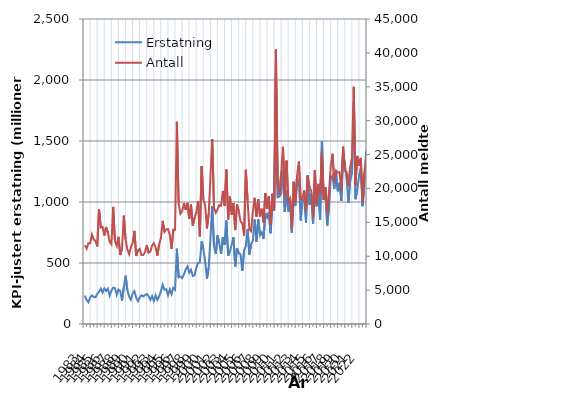
| Category | Erstatning |
|---|---|
| 1983.0 | 232.937 |
| nan | 195.121 |
| nan | 178.438 |
| nan | 218.579 |
| 1984.0 | 234.389 |
| nan | 221.715 |
| nan | 219.826 |
| nan | 245.877 |
| 1985.0 | 265.702 |
| nan | 290.42 |
| nan | 257.346 |
| nan | 291.865 |
| 1986.0 | 270.604 |
| nan | 289.558 |
| nan | 233.055 |
| nan | 272.728 |
| 1987.0 | 297.95 |
| nan | 294.021 |
| nan | 240.61 |
| nan | 283.085 |
| 1988.0 | 269.44 |
| nan | 192.069 |
| nan | 299.153 |
| nan | 396.293 |
| 1989.0 | 279.972 |
| nan | 226.285 |
| nan | 199.112 |
| nan | 251.201 |
| 1990.0 | 268.971 |
| nan | 216.388 |
| nan | 187.666 |
| nan | 218.436 |
| 1991.0 | 235.713 |
| nan | 226.637 |
| nan | 237.191 |
| nan | 245.226 |
| 1992.0 | 229.086 |
| nan | 197.393 |
| nan | 228.083 |
| nan | 188.213 |
| 1993.0 | 236.156 |
| nan | 196.535 |
| nan | 227.061 |
| nan | 268.62 |
| 1994.0 | 321.731 |
| nan | 281.266 |
| nan | 285.763 |
| nan | 235.54 |
| 1995.0 | 283.776 |
| nan | 244.132 |
| nan | 296.645 |
| nan | 281.65 |
| 1996.0 | 617.657 |
| nan | 382.464 |
| nan | 389.296 |
| nan | 375.446 |
| 1997.0 | 406.453 |
| nan | 446.013 |
| nan | 472.333 |
| nan | 421.43 |
| 1998.0 | 444.599 |
| nan | 393.872 |
| nan | 400.307 |
| nan | 460.108 |
| 1999.0 | 501.845 |
| nan | 504.283 |
| nan | 678.577 |
| nan | 614.541 |
| 2000.0 | 512.261 |
| nan | 372.014 |
| nan | 461.192 |
| nan | 703.176 |
| 2001.0 | 965.028 |
| nan | 638.852 |
| nan | 573.774 |
| nan | 725.942 |
| 2002.0 | 661.156 |
| nan | 575.27 |
| nan | 710.935 |
| nan | 647.82 |
| 2003.0 | 847.26 |
| nan | 560.178 |
| nan | 595.958 |
| nan | 649.208 |
| 2004.0 | 712.217 |
| nan | 470.87 |
| nan | 622.509 |
| nan | 581.854 |
| 2005.0 | 569.493 |
| nan | 434.602 |
| nan | 603.345 |
| nan | 639.394 |
| 2006.0 | 777.195 |
| nan | 569.965 |
| nan | 655.815 |
| nan | 684.196 |
| 2007.0 | 856.408 |
| nan | 673.317 |
| nan | 860.276 |
| nan | 727.347 |
| 2008.0 | 752.172 |
| nan | 696.322 |
| nan | 909.437 |
| nan | 873.42 |
| 2009.0 | 916.557 |
| nan | 744.098 |
| nan | 982.934 |
| nan | 929.078 |
| 2010.0 | 2038.021 |
| nan | 1039.492 |
| nan | 1044.493 |
| nan | 1068.56 |
| 2011.0 | 1262.842 |
| nan | 918.31 |
| nan | 1094.943 |
| nan | 922.779 |
| 2012.0 | 1022.313 |
| nan | 747.404 |
| nan | 1030.461 |
| nan | 970.277 |
| 2013.0 | 1191.601 |
| nan | 1166.802 |
| nan | 849.019 |
| nan | 1025.516 |
| 2014.0 | 1011.435 |
| nan | 830.588 |
| nan | 1221.838 |
| nan | 976.933 |
| 2015.0 | 1071.822 |
| nan | 820.828 |
| nan | 1086.542 |
| nan | 964.725 |
| 2016.0 | 1109.027 |
| nan | 853.659 |
| nan | 1497.167 |
| nan | 1015.828 |
| 2017.0 | 1088.954 |
| nan | 807.65 |
| nan | 953.843 |
| nan | 1191.034 |
| 2018.0 | 1215.874 |
| nan | 1106.121 |
| nan | 1232.942 |
| nan | 1087.816 |
| 2019.0 | 1157.146 |
| nan | 1008.947 |
| nan | 1404.229 |
| nan | 1307.73 |
| 2020.0 | 1182.332 |
| nan | 993.156 |
| nan | 1171.889 |
| nan | 1232.253 |
| 2021.0 | 1816.342 |
| nan | 1023.29 |
| nan | 1100.926 |
| nan | 1213.6 |
| 2022.0 | 1280.476 |
| nan | 966.126 |
| nan | 1138.392 |
| nan | 1421.118 |